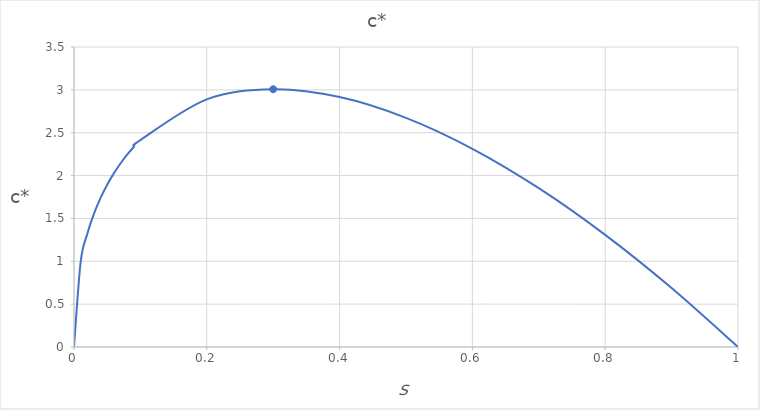
| Category | c* |
|---|---|
| 0.0 | 0 |
| 0.01 | 0.99 |
| 0.02 | 1.319 |
| 0.03 | 1.553 |
| 0.04 | 1.739 |
| 0.05 | 1.894 |
| 0.06 | 2.026 |
| 0.07 | 2.141 |
| 0.08 | 2.243 |
| 0.09 | 2.333 |
| 0.1 | 2.414 |
| 0.2 | 2.889 |
| 0.3 | 3.007 |
| 0.4 | 2.916 |
| 0.5 | 2.674 |
| 0.6 | 2.313 |
| 0.7 | 1.853 |
| 0.8 | 1.308 |
| 0.9 | 0.688 |
| 1.0 | 0 |